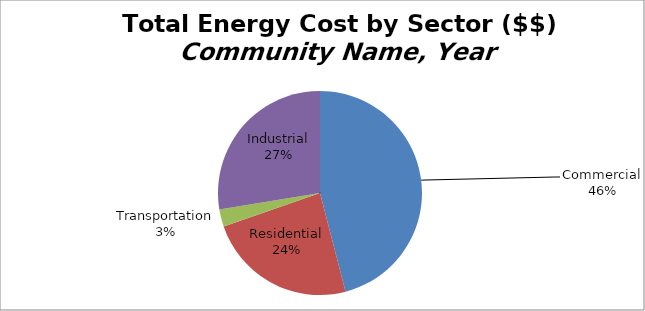
| Category | Series 0 |
|---|---|
| Commercial | 45.971 |
| Residential | 23.701 |
| Transportation | 2.741 |
| Industrial | 27.588 |